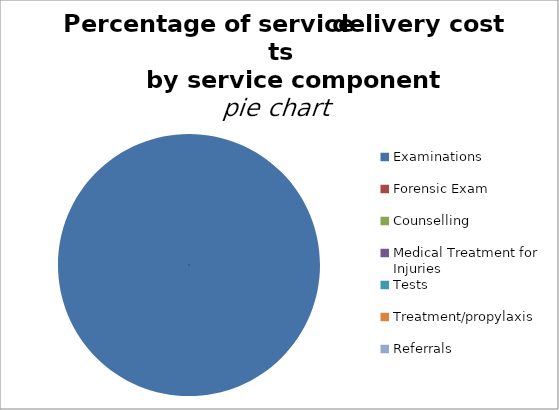
| Category | Series 0 |
|---|---|
| Examinations | 6.873 |
| Forensic Exam | 0 |
| Counselling | 0 |
| Medical Treatment for Injuries | 0 |
| Tests  | 0 |
| Treatment/propylaxis  | 0 |
| Referrals | 0 |